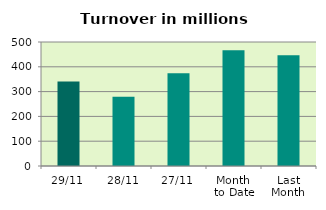
| Category | Series 0 |
|---|---|
| 29/11 | 341.023 |
| 28/11 | 278.848 |
| 27/11 | 374.305 |
| Month 
to Date | 466.544 |
| Last
Month | 446.481 |